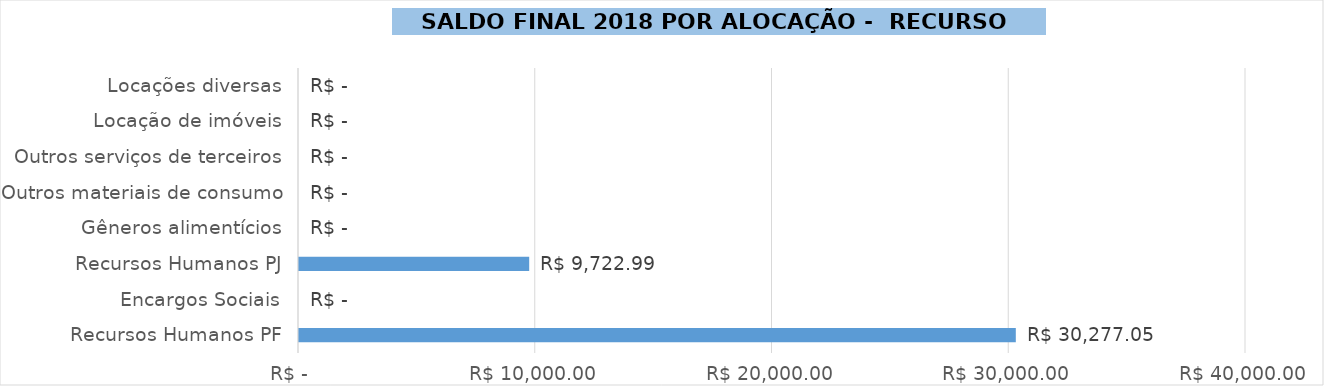
| Category | Saldo Parceria |
|---|---|
| Recursos Humanos PF | 30277.054 |
| Encargos Sociais | 0 |
| Recursos Humanos PJ | 9722.986 |
| Gêneros alimentícios | 0 |
| Outros materiais de consumo | 0 |
| Outros serviços de terceiros | 0 |
| Locação de imóveis | 0 |
| Locações diversas | 0 |